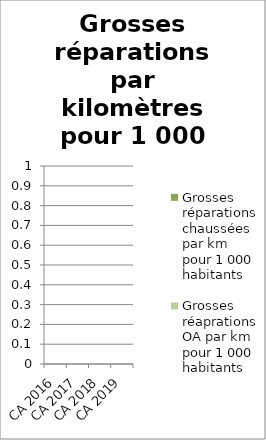
| Category | Grosses réparations chaussées par km pour 1 000 habitants  | Grosses réaprations OA par km pour 1 000 habitants |
|---|---|---|
| CA 2016 | 0 | 0 |
| CA 2017 | 0 | 0 |
| CA 2018 | 0 | 0 |
| CA 2019 | 0 | 0 |